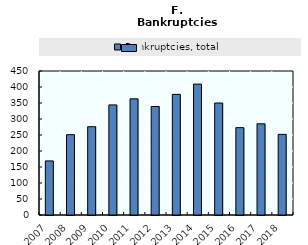
| Category | Bankruptcies, total |
|---|---|
| 2007.0 | 169 |
| 2008.0 | 251 |
| 2009.0 | 276 |
| 2010.0 | 344 |
| 2011.0 | 363 |
| 2012.0 | 339 |
| 2013.0 | 377 |
| 2014.0 | 409 |
| 2015.0 | 350 |
| 2016.0 | 273 |
| 2017.0 | 285 |
| 2018.0 | 252 |